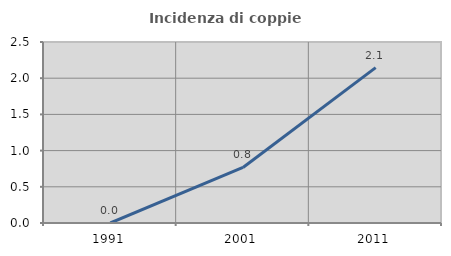
| Category | Incidenza di coppie miste |
|---|---|
| 1991.0 | 0 |
| 2001.0 | 0.767 |
| 2011.0 | 2.146 |